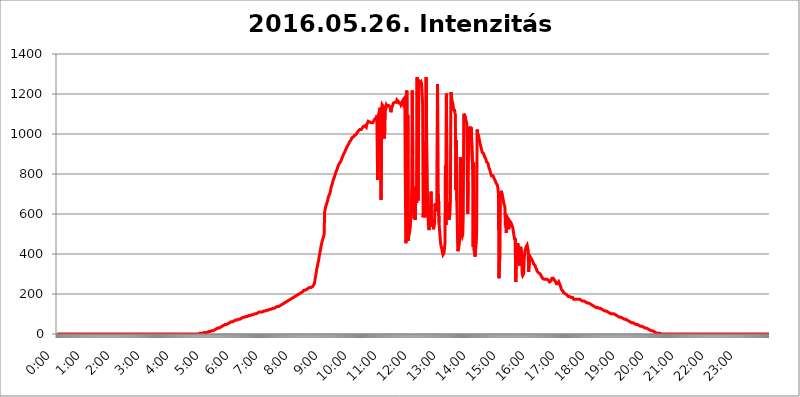
| Category | 2016.05.26. Intenzitás [W/m^2] |
|---|---|
| 0.0 | 0 |
| 0.0006944444444444445 | 0 |
| 0.001388888888888889 | 0 |
| 0.0020833333333333333 | 0 |
| 0.002777777777777778 | 0 |
| 0.003472222222222222 | 0 |
| 0.004166666666666667 | 0 |
| 0.004861111111111111 | 0 |
| 0.005555555555555556 | 0 |
| 0.0062499999999999995 | 0 |
| 0.006944444444444444 | 0 |
| 0.007638888888888889 | 0 |
| 0.008333333333333333 | 0 |
| 0.009027777777777779 | 0 |
| 0.009722222222222222 | 0 |
| 0.010416666666666666 | 0 |
| 0.011111111111111112 | 0 |
| 0.011805555555555555 | 0 |
| 0.012499999999999999 | 0 |
| 0.013194444444444444 | 0 |
| 0.013888888888888888 | 0 |
| 0.014583333333333332 | 0 |
| 0.015277777777777777 | 0 |
| 0.015972222222222224 | 0 |
| 0.016666666666666666 | 0 |
| 0.017361111111111112 | 0 |
| 0.018055555555555557 | 0 |
| 0.01875 | 0 |
| 0.019444444444444445 | 0 |
| 0.02013888888888889 | 0 |
| 0.020833333333333332 | 0 |
| 0.02152777777777778 | 0 |
| 0.022222222222222223 | 0 |
| 0.02291666666666667 | 0 |
| 0.02361111111111111 | 0 |
| 0.024305555555555556 | 0 |
| 0.024999999999999998 | 0 |
| 0.025694444444444447 | 0 |
| 0.02638888888888889 | 0 |
| 0.027083333333333334 | 0 |
| 0.027777777777777776 | 0 |
| 0.02847222222222222 | 0 |
| 0.029166666666666664 | 0 |
| 0.029861111111111113 | 0 |
| 0.030555555555555555 | 0 |
| 0.03125 | 0 |
| 0.03194444444444445 | 0 |
| 0.03263888888888889 | 0 |
| 0.03333333333333333 | 0 |
| 0.034027777777777775 | 0 |
| 0.034722222222222224 | 0 |
| 0.035416666666666666 | 0 |
| 0.036111111111111115 | 0 |
| 0.03680555555555556 | 0 |
| 0.0375 | 0 |
| 0.03819444444444444 | 0 |
| 0.03888888888888889 | 0 |
| 0.03958333333333333 | 0 |
| 0.04027777777777778 | 0 |
| 0.04097222222222222 | 0 |
| 0.041666666666666664 | 0 |
| 0.042361111111111106 | 0 |
| 0.04305555555555556 | 0 |
| 0.043750000000000004 | 0 |
| 0.044444444444444446 | 0 |
| 0.04513888888888889 | 0 |
| 0.04583333333333334 | 0 |
| 0.04652777777777778 | 0 |
| 0.04722222222222222 | 0 |
| 0.04791666666666666 | 0 |
| 0.04861111111111111 | 0 |
| 0.049305555555555554 | 0 |
| 0.049999999999999996 | 0 |
| 0.05069444444444445 | 0 |
| 0.051388888888888894 | 0 |
| 0.052083333333333336 | 0 |
| 0.05277777777777778 | 0 |
| 0.05347222222222222 | 0 |
| 0.05416666666666667 | 0 |
| 0.05486111111111111 | 0 |
| 0.05555555555555555 | 0 |
| 0.05625 | 0 |
| 0.05694444444444444 | 0 |
| 0.057638888888888885 | 0 |
| 0.05833333333333333 | 0 |
| 0.05902777777777778 | 0 |
| 0.059722222222222225 | 0 |
| 0.06041666666666667 | 0 |
| 0.061111111111111116 | 0 |
| 0.06180555555555556 | 0 |
| 0.0625 | 0 |
| 0.06319444444444444 | 0 |
| 0.06388888888888888 | 0 |
| 0.06458333333333334 | 0 |
| 0.06527777777777778 | 0 |
| 0.06597222222222222 | 0 |
| 0.06666666666666667 | 0 |
| 0.06736111111111111 | 0 |
| 0.06805555555555555 | 0 |
| 0.06874999999999999 | 0 |
| 0.06944444444444443 | 0 |
| 0.07013888888888889 | 0 |
| 0.07083333333333333 | 0 |
| 0.07152777777777779 | 0 |
| 0.07222222222222223 | 0 |
| 0.07291666666666667 | 0 |
| 0.07361111111111111 | 0 |
| 0.07430555555555556 | 0 |
| 0.075 | 0 |
| 0.07569444444444444 | 0 |
| 0.0763888888888889 | 0 |
| 0.07708333333333334 | 0 |
| 0.07777777777777778 | 0 |
| 0.07847222222222222 | 0 |
| 0.07916666666666666 | 0 |
| 0.0798611111111111 | 0 |
| 0.08055555555555556 | 0 |
| 0.08125 | 0 |
| 0.08194444444444444 | 0 |
| 0.08263888888888889 | 0 |
| 0.08333333333333333 | 0 |
| 0.08402777777777777 | 0 |
| 0.08472222222222221 | 0 |
| 0.08541666666666665 | 0 |
| 0.08611111111111112 | 0 |
| 0.08680555555555557 | 0 |
| 0.08750000000000001 | 0 |
| 0.08819444444444445 | 0 |
| 0.08888888888888889 | 0 |
| 0.08958333333333333 | 0 |
| 0.09027777777777778 | 0 |
| 0.09097222222222222 | 0 |
| 0.09166666666666667 | 0 |
| 0.09236111111111112 | 0 |
| 0.09305555555555556 | 0 |
| 0.09375 | 0 |
| 0.09444444444444444 | 0 |
| 0.09513888888888888 | 0 |
| 0.09583333333333333 | 0 |
| 0.09652777777777777 | 0 |
| 0.09722222222222222 | 0 |
| 0.09791666666666667 | 0 |
| 0.09861111111111111 | 0 |
| 0.09930555555555555 | 0 |
| 0.09999999999999999 | 0 |
| 0.10069444444444443 | 0 |
| 0.1013888888888889 | 0 |
| 0.10208333333333335 | 0 |
| 0.10277777777777779 | 0 |
| 0.10347222222222223 | 0 |
| 0.10416666666666667 | 0 |
| 0.10486111111111111 | 0 |
| 0.10555555555555556 | 0 |
| 0.10625 | 0 |
| 0.10694444444444444 | 0 |
| 0.1076388888888889 | 0 |
| 0.10833333333333334 | 0 |
| 0.10902777777777778 | 0 |
| 0.10972222222222222 | 0 |
| 0.1111111111111111 | 0 |
| 0.11180555555555556 | 0 |
| 0.11180555555555556 | 0 |
| 0.1125 | 0 |
| 0.11319444444444444 | 0 |
| 0.11388888888888889 | 0 |
| 0.11458333333333333 | 0 |
| 0.11527777777777777 | 0 |
| 0.11597222222222221 | 0 |
| 0.11666666666666665 | 0 |
| 0.1173611111111111 | 0 |
| 0.11805555555555557 | 0 |
| 0.11944444444444445 | 0 |
| 0.12013888888888889 | 0 |
| 0.12083333333333333 | 0 |
| 0.12152777777777778 | 0 |
| 0.12222222222222223 | 0 |
| 0.12291666666666667 | 0 |
| 0.12291666666666667 | 0 |
| 0.12361111111111112 | 0 |
| 0.12430555555555556 | 0 |
| 0.125 | 0 |
| 0.12569444444444444 | 0 |
| 0.12638888888888888 | 0 |
| 0.12708333333333333 | 0 |
| 0.16875 | 0 |
| 0.12847222222222224 | 0 |
| 0.12916666666666668 | 0 |
| 0.12986111111111112 | 0 |
| 0.13055555555555556 | 0 |
| 0.13125 | 0 |
| 0.13194444444444445 | 0 |
| 0.1326388888888889 | 0 |
| 0.13333333333333333 | 0 |
| 0.13402777777777777 | 0 |
| 0.13402777777777777 | 0 |
| 0.13472222222222222 | 0 |
| 0.13541666666666666 | 0 |
| 0.1361111111111111 | 0 |
| 0.13749999999999998 | 0 |
| 0.13819444444444443 | 0 |
| 0.1388888888888889 | 0 |
| 0.13958333333333334 | 0 |
| 0.14027777777777778 | 0 |
| 0.14097222222222222 | 0 |
| 0.14166666666666666 | 0 |
| 0.1423611111111111 | 0 |
| 0.14305555555555557 | 0 |
| 0.14375000000000002 | 0 |
| 0.14444444444444446 | 0 |
| 0.1451388888888889 | 0 |
| 0.1451388888888889 | 0 |
| 0.14652777777777778 | 0 |
| 0.14722222222222223 | 0 |
| 0.14791666666666667 | 0 |
| 0.1486111111111111 | 0 |
| 0.14930555555555555 | 0 |
| 0.15 | 0 |
| 0.15069444444444444 | 0 |
| 0.15138888888888888 | 0 |
| 0.15208333333333332 | 0 |
| 0.15277777777777776 | 0 |
| 0.15347222222222223 | 0 |
| 0.15416666666666667 | 0 |
| 0.15486111111111112 | 0 |
| 0.15555555555555556 | 0 |
| 0.15625 | 0 |
| 0.15694444444444444 | 0 |
| 0.15763888888888888 | 0 |
| 0.15833333333333333 | 0 |
| 0.15902777777777777 | 0 |
| 0.15972222222222224 | 0 |
| 0.16041666666666668 | 0 |
| 0.16111111111111112 | 0 |
| 0.16180555555555556 | 0 |
| 0.1625 | 0 |
| 0.16319444444444445 | 0 |
| 0.1638888888888889 | 0 |
| 0.16458333333333333 | 0 |
| 0.16527777777777777 | 0 |
| 0.16597222222222222 | 0 |
| 0.16666666666666666 | 0 |
| 0.1673611111111111 | 0 |
| 0.16805555555555554 | 0 |
| 0.16874999999999998 | 0 |
| 0.16944444444444443 | 0 |
| 0.17013888888888887 | 0 |
| 0.1708333333333333 | 0 |
| 0.17152777777777775 | 0 |
| 0.17222222222222225 | 0 |
| 0.1729166666666667 | 0 |
| 0.17361111111111113 | 0 |
| 0.17430555555555557 | 0 |
| 0.17500000000000002 | 0 |
| 0.17569444444444446 | 0 |
| 0.1763888888888889 | 0 |
| 0.17708333333333334 | 0 |
| 0.17777777777777778 | 0 |
| 0.17847222222222223 | 0 |
| 0.17916666666666667 | 0 |
| 0.1798611111111111 | 0 |
| 0.18055555555555555 | 0 |
| 0.18125 | 0 |
| 0.18194444444444444 | 0 |
| 0.1826388888888889 | 0 |
| 0.18333333333333335 | 0 |
| 0.1840277777777778 | 0 |
| 0.18472222222222223 | 0 |
| 0.18541666666666667 | 0 |
| 0.18611111111111112 | 0 |
| 0.18680555555555556 | 0 |
| 0.1875 | 0 |
| 0.18819444444444444 | 0 |
| 0.18888888888888888 | 0 |
| 0.18958333333333333 | 0 |
| 0.19027777777777777 | 0 |
| 0.1909722222222222 | 0 |
| 0.19166666666666665 | 0 |
| 0.19236111111111112 | 0 |
| 0.19305555555555554 | 0 |
| 0.19375 | 0 |
| 0.19444444444444445 | 0 |
| 0.1951388888888889 | 0 |
| 0.19583333333333333 | 0 |
| 0.19652777777777777 | 0 |
| 0.19722222222222222 | 0 |
| 0.19791666666666666 | 0 |
| 0.1986111111111111 | 0 |
| 0.19930555555555554 | 3.525 |
| 0.19999999999999998 | 3.525 |
| 0.20069444444444443 | 3.525 |
| 0.20138888888888887 | 3.525 |
| 0.2020833333333333 | 3.525 |
| 0.2027777777777778 | 3.525 |
| 0.2034722222222222 | 3.525 |
| 0.2041666666666667 | 3.525 |
| 0.20486111111111113 | 3.525 |
| 0.20555555555555557 | 3.525 |
| 0.20625000000000002 | 7.887 |
| 0.20694444444444446 | 7.887 |
| 0.2076388888888889 | 7.887 |
| 0.20833333333333334 | 7.887 |
| 0.20902777777777778 | 7.887 |
| 0.20972222222222223 | 7.887 |
| 0.21041666666666667 | 7.887 |
| 0.2111111111111111 | 7.887 |
| 0.21180555555555555 | 12.257 |
| 0.2125 | 12.257 |
| 0.21319444444444444 | 12.257 |
| 0.2138888888888889 | 12.257 |
| 0.21458333333333335 | 12.257 |
| 0.2152777777777778 | 12.257 |
| 0.21597222222222223 | 12.257 |
| 0.21666666666666667 | 16.636 |
| 0.21736111111111112 | 16.636 |
| 0.21805555555555556 | 16.636 |
| 0.21875 | 16.636 |
| 0.21944444444444444 | 21.024 |
| 0.22013888888888888 | 21.024 |
| 0.22083333333333333 | 21.024 |
| 0.22152777777777777 | 25.419 |
| 0.2222222222222222 | 25.419 |
| 0.22291666666666665 | 25.419 |
| 0.2236111111111111 | 25.419 |
| 0.22430555555555556 | 29.823 |
| 0.225 | 29.823 |
| 0.22569444444444445 | 29.823 |
| 0.2263888888888889 | 29.823 |
| 0.22708333333333333 | 29.823 |
| 0.22777777777777777 | 34.234 |
| 0.22847222222222222 | 34.234 |
| 0.22916666666666666 | 34.234 |
| 0.2298611111111111 | 38.653 |
| 0.23055555555555554 | 38.653 |
| 0.23124999999999998 | 38.653 |
| 0.23194444444444443 | 38.653 |
| 0.23263888888888887 | 43.079 |
| 0.2333333333333333 | 43.079 |
| 0.2340277777777778 | 43.079 |
| 0.2347222222222222 | 47.511 |
| 0.2354166666666667 | 47.511 |
| 0.23611111111111113 | 47.511 |
| 0.23680555555555557 | 47.511 |
| 0.23750000000000002 | 47.511 |
| 0.23819444444444446 | 51.951 |
| 0.2388888888888889 | 51.951 |
| 0.23958333333333334 | 51.951 |
| 0.24027777777777778 | 56.398 |
| 0.24097222222222223 | 56.398 |
| 0.24166666666666667 | 56.398 |
| 0.2423611111111111 | 56.398 |
| 0.24305555555555555 | 56.398 |
| 0.24375 | 60.85 |
| 0.24444444444444446 | 60.85 |
| 0.24513888888888888 | 60.85 |
| 0.24583333333333335 | 60.85 |
| 0.2465277777777778 | 65.31 |
| 0.24722222222222223 | 65.31 |
| 0.24791666666666667 | 65.31 |
| 0.24861111111111112 | 65.31 |
| 0.24930555555555556 | 65.31 |
| 0.25 | 69.775 |
| 0.25069444444444444 | 69.775 |
| 0.2513888888888889 | 69.775 |
| 0.2520833333333333 | 69.775 |
| 0.25277777777777777 | 69.775 |
| 0.2534722222222222 | 74.246 |
| 0.25416666666666665 | 74.246 |
| 0.2548611111111111 | 74.246 |
| 0.2555555555555556 | 74.246 |
| 0.25625000000000003 | 74.246 |
| 0.2569444444444445 | 74.246 |
| 0.2576388888888889 | 78.722 |
| 0.25833333333333336 | 78.722 |
| 0.2590277777777778 | 78.722 |
| 0.25972222222222224 | 78.722 |
| 0.2604166666666667 | 83.205 |
| 0.2611111111111111 | 83.205 |
| 0.26180555555555557 | 83.205 |
| 0.2625 | 83.205 |
| 0.26319444444444445 | 83.205 |
| 0.2638888888888889 | 83.205 |
| 0.26458333333333334 | 87.692 |
| 0.2652777777777778 | 87.692 |
| 0.2659722222222222 | 87.692 |
| 0.26666666666666666 | 87.692 |
| 0.2673611111111111 | 87.692 |
| 0.26805555555555555 | 87.692 |
| 0.26875 | 92.184 |
| 0.26944444444444443 | 92.184 |
| 0.2701388888888889 | 92.184 |
| 0.2708333333333333 | 92.184 |
| 0.27152777777777776 | 92.184 |
| 0.2722222222222222 | 92.184 |
| 0.27291666666666664 | 96.682 |
| 0.2736111111111111 | 96.682 |
| 0.2743055555555555 | 96.682 |
| 0.27499999999999997 | 96.682 |
| 0.27569444444444446 | 101.184 |
| 0.27638888888888885 | 101.184 |
| 0.27708333333333335 | 101.184 |
| 0.2777777777777778 | 101.184 |
| 0.27847222222222223 | 101.184 |
| 0.2791666666666667 | 101.184 |
| 0.2798611111111111 | 101.184 |
| 0.28055555555555556 | 101.184 |
| 0.28125 | 105.69 |
| 0.28194444444444444 | 105.69 |
| 0.2826388888888889 | 105.69 |
| 0.2833333333333333 | 110.201 |
| 0.28402777777777777 | 110.201 |
| 0.2847222222222222 | 110.201 |
| 0.28541666666666665 | 110.201 |
| 0.28611111111111115 | 110.201 |
| 0.28680555555555554 | 110.201 |
| 0.28750000000000003 | 110.201 |
| 0.2881944444444445 | 114.716 |
| 0.2888888888888889 | 114.716 |
| 0.28958333333333336 | 114.716 |
| 0.2902777777777778 | 114.716 |
| 0.29097222222222224 | 114.716 |
| 0.2916666666666667 | 114.716 |
| 0.2923611111111111 | 119.235 |
| 0.29305555555555557 | 119.235 |
| 0.29375 | 119.235 |
| 0.29444444444444445 | 119.235 |
| 0.2951388888888889 | 119.235 |
| 0.29583333333333334 | 119.235 |
| 0.2965277777777778 | 119.235 |
| 0.2972222222222222 | 123.758 |
| 0.29791666666666666 | 123.758 |
| 0.2986111111111111 | 123.758 |
| 0.29930555555555555 | 123.758 |
| 0.3 | 123.758 |
| 0.30069444444444443 | 128.284 |
| 0.3013888888888889 | 128.284 |
| 0.3020833333333333 | 128.284 |
| 0.30277777777777776 | 128.284 |
| 0.3034722222222222 | 128.284 |
| 0.30416666666666664 | 128.284 |
| 0.3048611111111111 | 128.284 |
| 0.3055555555555555 | 128.284 |
| 0.30624999999999997 | 132.814 |
| 0.3069444444444444 | 132.814 |
| 0.3076388888888889 | 132.814 |
| 0.30833333333333335 | 137.347 |
| 0.3090277777777778 | 137.347 |
| 0.30972222222222223 | 137.347 |
| 0.3104166666666667 | 137.347 |
| 0.3111111111111111 | 141.884 |
| 0.31180555555555556 | 141.884 |
| 0.3125 | 141.884 |
| 0.31319444444444444 | 146.423 |
| 0.3138888888888889 | 146.423 |
| 0.3145833333333333 | 146.423 |
| 0.31527777777777777 | 150.964 |
| 0.3159722222222222 | 150.964 |
| 0.31666666666666665 | 150.964 |
| 0.31736111111111115 | 150.964 |
| 0.31805555555555554 | 155.509 |
| 0.31875000000000003 | 155.509 |
| 0.3194444444444445 | 155.509 |
| 0.3201388888888889 | 160.056 |
| 0.32083333333333336 | 160.056 |
| 0.3215277777777778 | 164.605 |
| 0.32222222222222224 | 164.605 |
| 0.3229166666666667 | 164.605 |
| 0.3236111111111111 | 164.605 |
| 0.32430555555555557 | 169.156 |
| 0.325 | 169.156 |
| 0.32569444444444445 | 173.709 |
| 0.3263888888888889 | 173.709 |
| 0.32708333333333334 | 173.709 |
| 0.3277777777777778 | 173.709 |
| 0.3284722222222222 | 173.709 |
| 0.32916666666666666 | 178.264 |
| 0.3298611111111111 | 178.264 |
| 0.33055555555555555 | 178.264 |
| 0.33125 | 182.82 |
| 0.33194444444444443 | 182.82 |
| 0.3326388888888889 | 182.82 |
| 0.3333333333333333 | 187.378 |
| 0.3340277777777778 | 187.378 |
| 0.3347222222222222 | 191.937 |
| 0.3354166666666667 | 191.937 |
| 0.3361111111111111 | 191.937 |
| 0.3368055555555556 | 196.497 |
| 0.33749999999999997 | 196.497 |
| 0.33819444444444446 | 196.497 |
| 0.33888888888888885 | 201.058 |
| 0.33958333333333335 | 201.058 |
| 0.34027777777777773 | 201.058 |
| 0.34097222222222223 | 205.62 |
| 0.3416666666666666 | 205.62 |
| 0.3423611111111111 | 205.62 |
| 0.3430555555555555 | 210.182 |
| 0.34375 | 210.182 |
| 0.3444444444444445 | 214.746 |
| 0.3451388888888889 | 214.746 |
| 0.3458333333333334 | 219.309 |
| 0.34652777777777777 | 219.309 |
| 0.34722222222222227 | 219.309 |
| 0.34791666666666665 | 219.309 |
| 0.34861111111111115 | 223.873 |
| 0.34930555555555554 | 223.873 |
| 0.35000000000000003 | 223.873 |
| 0.3506944444444444 | 228.436 |
| 0.3513888888888889 | 228.436 |
| 0.3520833333333333 | 228.436 |
| 0.3527777777777778 | 228.436 |
| 0.3534722222222222 | 233 |
| 0.3541666666666667 | 233 |
| 0.3548611111111111 | 233 |
| 0.35555555555555557 | 233 |
| 0.35625 | 233 |
| 0.35694444444444445 | 237.564 |
| 0.3576388888888889 | 237.564 |
| 0.35833333333333334 | 237.564 |
| 0.3590277777777778 | 242.127 |
| 0.3597222222222222 | 242.127 |
| 0.36041666666666666 | 251.251 |
| 0.3611111111111111 | 260.373 |
| 0.36180555555555555 | 278.603 |
| 0.3625 | 292.259 |
| 0.36319444444444443 | 305.898 |
| 0.3638888888888889 | 324.052 |
| 0.3645833333333333 | 333.113 |
| 0.3652777777777778 | 346.682 |
| 0.3659722222222222 | 360.221 |
| 0.3666666666666667 | 369.23 |
| 0.3673611111111111 | 387.202 |
| 0.3680555555555556 | 400.638 |
| 0.36874999999999997 | 414.035 |
| 0.36944444444444446 | 427.39 |
| 0.37013888888888885 | 440.702 |
| 0.37083333333333335 | 453.968 |
| 0.37152777777777773 | 462.786 |
| 0.37222222222222223 | 471.582 |
| 0.3729166666666666 | 480.356 |
| 0.3736111111111111 | 489.108 |
| 0.3743055555555555 | 497.836 |
| 0.375 | 609.062 |
| 0.3756944444444445 | 621.613 |
| 0.3763888888888889 | 634.105 |
| 0.3770833333333334 | 642.4 |
| 0.37777777777777777 | 650.667 |
| 0.37847222222222227 | 658.909 |
| 0.37916666666666665 | 667.123 |
| 0.37986111111111115 | 679.395 |
| 0.38055555555555554 | 687.544 |
| 0.38125000000000003 | 691.608 |
| 0.3819444444444444 | 699.717 |
| 0.3826388888888889 | 707.8 |
| 0.3833333333333333 | 715.858 |
| 0.3840277777777778 | 731.896 |
| 0.3847222222222222 | 739.877 |
| 0.3854166666666667 | 747.834 |
| 0.3861111111111111 | 755.766 |
| 0.38680555555555557 | 767.62 |
| 0.3875 | 771.559 |
| 0.38819444444444445 | 779.42 |
| 0.3888888888888889 | 787.258 |
| 0.38958333333333334 | 795.074 |
| 0.3902777777777778 | 802.868 |
| 0.3909722222222222 | 810.641 |
| 0.39166666666666666 | 814.519 |
| 0.3923611111111111 | 822.26 |
| 0.39305555555555555 | 829.981 |
| 0.39375 | 837.682 |
| 0.39444444444444443 | 845.365 |
| 0.3951388888888889 | 849.199 |
| 0.3958333333333333 | 853.029 |
| 0.3965277777777778 | 856.855 |
| 0.3972222222222222 | 860.676 |
| 0.3979166666666667 | 864.493 |
| 0.3986111111111111 | 872.114 |
| 0.3993055555555556 | 879.719 |
| 0.39999999999999997 | 883.516 |
| 0.40069444444444446 | 891.099 |
| 0.40138888888888885 | 898.668 |
| 0.40208333333333335 | 902.447 |
| 0.40277777777777773 | 906.223 |
| 0.40347222222222223 | 913.766 |
| 0.4041666666666666 | 917.534 |
| 0.4048611111111111 | 917.534 |
| 0.4055555555555555 | 928.819 |
| 0.40625 | 932.576 |
| 0.4069444444444445 | 940.082 |
| 0.4076388888888889 | 943.832 |
| 0.4083333333333334 | 947.58 |
| 0.40902777777777777 | 951.327 |
| 0.40972222222222227 | 958.814 |
| 0.41041666666666665 | 962.555 |
| 0.41111111111111115 | 966.295 |
| 0.41180555555555554 | 970.034 |
| 0.41250000000000003 | 973.772 |
| 0.4131944444444444 | 981.244 |
| 0.4138888888888889 | 981.244 |
| 0.4145833333333333 | 981.244 |
| 0.4152777777777778 | 984.98 |
| 0.4159722222222222 | 988.714 |
| 0.4166666666666667 | 992.448 |
| 0.4173611111111111 | 996.182 |
| 0.41805555555555557 | 996.182 |
| 0.41875 | 996.182 |
| 0.41944444444444445 | 999.916 |
| 0.4201388888888889 | 1003.65 |
| 0.42083333333333334 | 1007.383 |
| 0.4215277777777778 | 1007.383 |
| 0.4222222222222222 | 1014.852 |
| 0.42291666666666666 | 1018.587 |
| 0.4236111111111111 | 1018.587 |
| 0.42430555555555555 | 1022.323 |
| 0.425 | 1022.323 |
| 0.42569444444444443 | 1022.323 |
| 0.4263888888888889 | 1022.323 |
| 0.4270833333333333 | 1026.06 |
| 0.4277777777777778 | 1029.798 |
| 0.4284722222222222 | 1033.537 |
| 0.4291666666666667 | 1037.277 |
| 0.4298611111111111 | 1037.277 |
| 0.4305555555555556 | 1041.019 |
| 0.43124999999999997 | 1041.019 |
| 0.43194444444444446 | 1041.019 |
| 0.43263888888888885 | 1041.019 |
| 0.43333333333333335 | 1033.537 |
| 0.43402777777777773 | 1048.508 |
| 0.43472222222222223 | 1052.255 |
| 0.4354166666666666 | 1056.004 |
| 0.4361111111111111 | 1063.51 |
| 0.4368055555555555 | 1063.51 |
| 0.4375 | 1059.756 |
| 0.4381944444444445 | 1059.756 |
| 0.4388888888888889 | 1059.756 |
| 0.4395833333333334 | 1059.756 |
| 0.44027777777777777 | 1056.004 |
| 0.44097222222222227 | 1052.255 |
| 0.44166666666666665 | 1052.255 |
| 0.44236111111111115 | 1056.004 |
| 0.44305555555555554 | 1059.756 |
| 0.44375000000000003 | 1063.51 |
| 0.4444444444444444 | 1067.267 |
| 0.4451388888888889 | 1074.789 |
| 0.4458333333333333 | 1078.555 |
| 0.4465277777777778 | 1078.555 |
| 0.4472222222222222 | 1078.555 |
| 0.4479166666666667 | 1082.324 |
| 0.4486111111111111 | 1093.653 |
| 0.44930555555555557 | 771.559 |
| 0.45 | 1089.873 |
| 0.45069444444444445 | 1093.653 |
| 0.4513888888888889 | 1093.653 |
| 0.45208333333333334 | 1116.426 |
| 0.4527777777777778 | 1131.708 |
| 0.4534722222222222 | 909.996 |
| 0.45416666666666666 | 671.22 |
| 0.4548611111111111 | 1124.056 |
| 0.45555555555555555 | 1147.086 |
| 0.45625 | 1147.086 |
| 0.45694444444444443 | 1139.384 |
| 0.4576388888888889 | 1135.543 |
| 0.4583333333333333 | 1124.056 |
| 0.4590277777777778 | 977.508 |
| 0.4597222222222222 | 1112.618 |
| 0.4604166666666667 | 1135.543 |
| 0.4611111111111111 | 1143.232 |
| 0.4618055555555556 | 1135.543 |
| 0.46249999999999997 | 1143.232 |
| 0.46319444444444446 | 1143.232 |
| 0.46388888888888885 | 1143.232 |
| 0.46458333333333335 | 1143.232 |
| 0.46527777777777773 | 1147.086 |
| 0.46597222222222223 | 1143.232 |
| 0.4666666666666666 | 1135.543 |
| 0.4673611111111111 | 1131.708 |
| 0.4680555555555555 | 1108.816 |
| 0.46875 | 1127.879 |
| 0.4694444444444445 | 1131.708 |
| 0.4701388888888889 | 1139.384 |
| 0.4708333333333334 | 1147.086 |
| 0.47152777777777777 | 1154.814 |
| 0.47222222222222227 | 1150.946 |
| 0.47291666666666665 | 1154.814 |
| 0.47361111111111115 | 1158.689 |
| 0.47430555555555554 | 1162.571 |
| 0.47500000000000003 | 1158.689 |
| 0.4756944444444444 | 1158.689 |
| 0.4763888888888889 | 1170.358 |
| 0.4770833333333333 | 1166.46 |
| 0.4777777777777778 | 1170.358 |
| 0.4784722222222222 | 1162.571 |
| 0.4791666666666667 | 1154.814 |
| 0.4798611111111111 | 1158.689 |
| 0.48055555555555557 | 1154.814 |
| 0.48125 | 1154.814 |
| 0.48194444444444445 | 1147.086 |
| 0.4826388888888889 | 1147.086 |
| 0.48333333333333334 | 1150.946 |
| 0.4840277777777778 | 1162.571 |
| 0.4847222222222222 | 1154.814 |
| 0.48541666666666666 | 1154.814 |
| 0.4861111111111111 | 1174.263 |
| 0.48680555555555555 | 1174.263 |
| 0.4875 | 1182.099 |
| 0.48819444444444443 | 763.674 |
| 0.4888888888888889 | 453.968 |
| 0.4895833333333333 | 480.356 |
| 0.4902777777777778 | 1217.812 |
| 0.4909722222222222 | 634.105 |
| 0.4916666666666667 | 1093.653 |
| 0.4923611111111111 | 467.187 |
| 0.4930555555555556 | 493.475 |
| 0.49374999999999997 | 502.192 |
| 0.49444444444444446 | 502.192 |
| 0.49513888888888885 | 532.513 |
| 0.49583333333333335 | 588.009 |
| 0.49652777777777773 | 629.948 |
| 0.49722222222222223 | 735.89 |
| 0.4979166666666666 | 1217.812 |
| 0.4986111111111111 | 898.668 |
| 0.4993055555555555 | 621.613 |
| 0.5 | 592.233 |
| 0.5006944444444444 | 575.299 |
| 0.5013888888888889 | 634.105 |
| 0.5020833333333333 | 571.049 |
| 0.5027777777777778 | 735.89 |
| 0.5034722222222222 | 679.395 |
| 0.5041666666666667 | 654.791 |
| 0.5048611111111111 | 1283.541 |
| 0.5055555555555555 | 723.889 |
| 0.50625 | 667.123 |
| 0.5069444444444444 | 1270.964 |
| 0.5076388888888889 | 1258.511 |
| 0.5083333333333333 | 1262.649 |
| 0.5090277777777777 | 1250.275 |
| 0.5097222222222222 | 1250.275 |
| 0.5104166666666666 | 1258.511 |
| 0.5111111111111112 | 1250.275 |
| 0.5118055555555555 | 1254.387 |
| 0.5125000000000001 | 1143.232 |
| 0.5131944444444444 | 583.779 |
| 0.513888888888889 | 625.784 |
| 0.5145833333333333 | 621.613 |
| 0.5152777777777778 | 962.555 |
| 0.5159722222222222 | 583.779 |
| 0.5166666666666667 | 779.42 |
| 0.517361111111111 | 1283.541 |
| 0.5180555555555556 | 988.714 |
| 0.5187499999999999 | 833.834 |
| 0.5194444444444445 | 642.4 |
| 0.5201388888888888 | 579.542 |
| 0.5208333333333334 | 528.2 |
| 0.5215277777777778 | 519.555 |
| 0.5222222222222223 | 553.986 |
| 0.5229166666666667 | 558.261 |
| 0.5236111111111111 | 634.105 |
| 0.5243055555555556 | 711.832 |
| 0.525 | 536.82 |
| 0.5256944444444445 | 545.416 |
| 0.5263888888888889 | 541.121 |
| 0.5270833333333333 | 566.793 |
| 0.5277777777777778 | 523.88 |
| 0.5284722222222222 | 519.555 |
| 0.5291666666666667 | 562.53 |
| 0.5298611111111111 | 650.667 |
| 0.5305555555555556 | 629.948 |
| 0.53125 | 654.791 |
| 0.5319444444444444 | 629.948 |
| 0.5326388888888889 | 613.252 |
| 0.5333333333333333 | 1250.275 |
| 0.5340277777777778 | 646.537 |
| 0.5347222222222222 | 699.717 |
| 0.5354166666666667 | 553.986 |
| 0.5361111111111111 | 523.88 |
| 0.5368055555555555 | 493.475 |
| 0.5375 | 458.38 |
| 0.5381944444444444 | 440.702 |
| 0.5388888888888889 | 440.702 |
| 0.5395833333333333 | 422.943 |
| 0.5402777777777777 | 405.108 |
| 0.5409722222222222 | 396.164 |
| 0.5416666666666666 | 391.685 |
| 0.5423611111111112 | 405.108 |
| 0.5430555555555555 | 427.39 |
| 0.5437500000000001 | 453.968 |
| 0.5444444444444444 | 841.526 |
| 0.545138888888889 | 545.416 |
| 0.5458333333333333 | 1201.843 |
| 0.5465277777777778 | 695.666 |
| 0.5472222222222222 | 625.784 |
| 0.5479166666666667 | 658.909 |
| 0.548611111111111 | 646.537 |
| 0.5493055555555556 | 571.049 |
| 0.5499999999999999 | 566.793 |
| 0.5506944444444445 | 600.661 |
| 0.5513888888888888 | 658.909 |
| 0.5520833333333334 | 1209.807 |
| 0.5527777777777778 | 1193.918 |
| 0.5534722222222223 | 1170.358 |
| 0.5541666666666667 | 1170.358 |
| 0.5548611111111111 | 1150.946 |
| 0.5555555555555556 | 1131.708 |
| 0.55625 | 1116.426 |
| 0.5569444444444445 | 1124.056 |
| 0.5576388888888889 | 1108.816 |
| 0.5583333333333333 | 1097.437 |
| 0.5590277777777778 | 719.877 |
| 0.5597222222222222 | 970.034 |
| 0.5604166666666667 | 667.123 |
| 0.5611111111111111 | 545.416 |
| 0.5618055555555556 | 414.035 |
| 0.5625 | 418.492 |
| 0.5631944444444444 | 431.833 |
| 0.5638888888888889 | 453.968 |
| 0.5645833333333333 | 475.972 |
| 0.5652777777777778 | 883.516 |
| 0.5659722222222222 | 849.199 |
| 0.5666666666666667 | 506.542 |
| 0.5673611111111111 | 510.885 |
| 0.5680555555555555 | 489.108 |
| 0.56875 | 497.836 |
| 0.5694444444444444 | 600.661 |
| 0.5701388888888889 | 1101.226 |
| 0.5708333333333333 | 1101.226 |
| 0.5715277777777777 | 1101.226 |
| 0.5722222222222222 | 1086.097 |
| 0.5729166666666666 | 1071.027 |
| 0.5736111111111112 | 1071.027 |
| 0.5743055555555555 | 1056.004 |
| 0.5750000000000001 | 1052.255 |
| 0.5756944444444444 | 600.661 |
| 0.576388888888889 | 759.723 |
| 0.5770833333333333 | 1033.537 |
| 0.5777777777777778 | 1026.06 |
| 0.5784722222222222 | 1026.06 |
| 0.5791666666666667 | 1037.277 |
| 0.579861111111111 | 1007.383 |
| 0.5805555555555556 | 1033.537 |
| 0.5812499999999999 | 1029.798 |
| 0.5819444444444445 | 1033.537 |
| 0.5826388888888888 | 822.26 |
| 0.5833333333333334 | 436.27 |
| 0.5840277777777778 | 856.855 |
| 0.5847222222222223 | 418.492 |
| 0.5854166666666667 | 396.164 |
| 0.5861111111111111 | 387.202 |
| 0.5868055555555556 | 391.685 |
| 0.5875 | 382.715 |
| 0.5881944444444445 | 510.885 |
| 0.5888888888888889 | 1022.323 |
| 0.5895833333333333 | 1003.65 |
| 0.5902777777777778 | 999.916 |
| 0.5909722222222222 | 992.448 |
| 0.5916666666666667 | 977.508 |
| 0.5923611111111111 | 962.555 |
| 0.5930555555555556 | 951.327 |
| 0.59375 | 940.082 |
| 0.5944444444444444 | 932.576 |
| 0.5951388888888889 | 921.298 |
| 0.5958333333333333 | 909.996 |
| 0.5965277777777778 | 909.996 |
| 0.5972222222222222 | 909.996 |
| 0.5979166666666667 | 902.447 |
| 0.5986111111111111 | 894.885 |
| 0.5993055555555555 | 887.309 |
| 0.6 | 883.516 |
| 0.6006944444444444 | 887.309 |
| 0.6013888888888889 | 872.114 |
| 0.6020833333333333 | 860.676 |
| 0.6027777777777777 | 856.855 |
| 0.6034722222222222 | 856.855 |
| 0.6041666666666666 | 853.029 |
| 0.6048611111111112 | 841.526 |
| 0.6055555555555555 | 829.981 |
| 0.6062500000000001 | 826.123 |
| 0.6069444444444444 | 818.392 |
| 0.607638888888889 | 806.757 |
| 0.6083333333333333 | 798.974 |
| 0.6090277777777778 | 791.169 |
| 0.6097222222222222 | 791.169 |
| 0.6104166666666667 | 791.169 |
| 0.611111111111111 | 791.169 |
| 0.6118055555555556 | 787.258 |
| 0.6124999999999999 | 779.42 |
| 0.6131944444444445 | 779.42 |
| 0.6138888888888888 | 779.42 |
| 0.6145833333333334 | 763.674 |
| 0.6152777777777778 | 755.766 |
| 0.6159722222222223 | 759.723 |
| 0.6166666666666667 | 751.803 |
| 0.6173611111111111 | 743.859 |
| 0.6180555555555556 | 727.896 |
| 0.61875 | 703.762 |
| 0.6194444444444445 | 278.603 |
| 0.6201388888888889 | 355.712 |
| 0.6208333333333333 | 373.729 |
| 0.6215277777777778 | 695.666 |
| 0.6222222222222222 | 715.858 |
| 0.6229166666666667 | 715.858 |
| 0.6236111111111111 | 703.762 |
| 0.6243055555555556 | 695.666 |
| 0.625 | 679.395 |
| 0.6256944444444444 | 667.123 |
| 0.6263888888888889 | 650.667 |
| 0.6270833333333333 | 650.667 |
| 0.6277777777777778 | 638.256 |
| 0.6284722222222222 | 541.121 |
| 0.6291666666666667 | 562.53 |
| 0.6298611111111111 | 506.542 |
| 0.6305555555555555 | 536.82 |
| 0.63125 | 583.779 |
| 0.6319444444444444 | 583.779 |
| 0.6326388888888889 | 575.299 |
| 0.6333333333333333 | 523.88 |
| 0.6340277777777777 | 566.793 |
| 0.6347222222222222 | 571.049 |
| 0.6354166666666666 | 566.793 |
| 0.6361111111111112 | 558.261 |
| 0.6368055555555555 | 553.986 |
| 0.6375000000000001 | 545.416 |
| 0.6381944444444444 | 541.121 |
| 0.638888888888889 | 532.513 |
| 0.6395833333333333 | 515.223 |
| 0.6402777777777778 | 497.836 |
| 0.6409722222222222 | 493.475 |
| 0.6416666666666667 | 471.582 |
| 0.642361111111111 | 480.356 |
| 0.6430555555555556 | 260.373 |
| 0.6437499999999999 | 346.682 |
| 0.6444444444444445 | 346.682 |
| 0.6451388888888888 | 373.729 |
| 0.6458333333333334 | 453.968 |
| 0.6465277777777778 | 431.833 |
| 0.6472222222222223 | 387.202 |
| 0.6479166666666667 | 418.492 |
| 0.6486111111111111 | 342.162 |
| 0.6493055555555556 | 427.39 |
| 0.65 | 436.27 |
| 0.6506944444444445 | 436.27 |
| 0.6513888888888889 | 396.164 |
| 0.6520833333333333 | 301.354 |
| 0.6527777777777778 | 292.259 |
| 0.6534722222222222 | 287.709 |
| 0.6541666666666667 | 301.354 |
| 0.6548611111111111 | 378.224 |
| 0.6555555555555556 | 400.638 |
| 0.65625 | 418.492 |
| 0.6569444444444444 | 422.943 |
| 0.6576388888888889 | 436.27 |
| 0.6583333333333333 | 440.702 |
| 0.6590277777777778 | 445.129 |
| 0.6597222222222222 | 431.833 |
| 0.6604166666666667 | 418.492 |
| 0.6611111111111111 | 310.44 |
| 0.6618055555555555 | 305.898 |
| 0.6625 | 378.224 |
| 0.6631944444444444 | 387.202 |
| 0.6638888888888889 | 382.715 |
| 0.6645833333333333 | 378.224 |
| 0.6652777777777777 | 373.729 |
| 0.6659722222222222 | 369.23 |
| 0.6666666666666666 | 369.23 |
| 0.6673611111111111 | 360.221 |
| 0.6680555555555556 | 351.198 |
| 0.6687500000000001 | 351.198 |
| 0.6694444444444444 | 351.198 |
| 0.6701388888888888 | 342.162 |
| 0.6708333333333334 | 333.113 |
| 0.6715277777777778 | 328.584 |
| 0.6722222222222222 | 324.052 |
| 0.6729166666666666 | 314.98 |
| 0.6736111111111112 | 314.98 |
| 0.6743055555555556 | 310.44 |
| 0.6749999999999999 | 305.898 |
| 0.6756944444444444 | 305.898 |
| 0.6763888888888889 | 301.354 |
| 0.6770833333333334 | 301.354 |
| 0.6777777777777777 | 296.808 |
| 0.6784722222222223 | 292.259 |
| 0.6791666666666667 | 287.709 |
| 0.6798611111111111 | 287.709 |
| 0.6805555555555555 | 278.603 |
| 0.68125 | 278.603 |
| 0.6819444444444445 | 274.047 |
| 0.6826388888888889 | 274.047 |
| 0.6833333333333332 | 274.047 |
| 0.6840277777777778 | 274.047 |
| 0.6847222222222222 | 274.047 |
| 0.6854166666666667 | 269.49 |
| 0.686111111111111 | 274.047 |
| 0.6868055555555556 | 274.047 |
| 0.6875 | 274.047 |
| 0.6881944444444444 | 274.047 |
| 0.688888888888889 | 269.49 |
| 0.6895833333333333 | 269.49 |
| 0.6902777777777778 | 260.373 |
| 0.6909722222222222 | 264.932 |
| 0.6916666666666668 | 264.932 |
| 0.6923611111111111 | 264.932 |
| 0.6930555555555555 | 269.49 |
| 0.69375 | 278.603 |
| 0.6944444444444445 | 278.603 |
| 0.6951388888888889 | 278.603 |
| 0.6958333333333333 | 278.603 |
| 0.6965277777777777 | 274.047 |
| 0.6972222222222223 | 269.49 |
| 0.6979166666666666 | 264.932 |
| 0.6986111111111111 | 264.932 |
| 0.6993055555555556 | 260.373 |
| 0.7000000000000001 | 251.251 |
| 0.7006944444444444 | 251.251 |
| 0.7013888888888888 | 246.689 |
| 0.7020833333333334 | 251.251 |
| 0.7027777777777778 | 255.813 |
| 0.7034722222222222 | 260.373 |
| 0.7041666666666666 | 260.373 |
| 0.7048611111111112 | 255.813 |
| 0.7055555555555556 | 242.127 |
| 0.7062499999999999 | 233 |
| 0.7069444444444444 | 223.873 |
| 0.7076388888888889 | 219.309 |
| 0.7083333333333334 | 219.309 |
| 0.7090277777777777 | 214.746 |
| 0.7097222222222223 | 210.182 |
| 0.7104166666666667 | 205.62 |
| 0.7111111111111111 | 205.62 |
| 0.7118055555555555 | 201.058 |
| 0.7125 | 201.058 |
| 0.7131944444444445 | 196.497 |
| 0.7138888888888889 | 196.497 |
| 0.7145833333333332 | 196.497 |
| 0.7152777777777778 | 191.937 |
| 0.7159722222222222 | 191.937 |
| 0.7166666666666667 | 187.378 |
| 0.717361111111111 | 187.378 |
| 0.7180555555555556 | 187.378 |
| 0.71875 | 187.378 |
| 0.7194444444444444 | 182.82 |
| 0.720138888888889 | 182.82 |
| 0.7208333333333333 | 182.82 |
| 0.7215277777777778 | 182.82 |
| 0.7222222222222222 | 182.82 |
| 0.7229166666666668 | 182.82 |
| 0.7236111111111111 | 178.264 |
| 0.7243055555555555 | 173.709 |
| 0.725 | 173.709 |
| 0.7256944444444445 | 173.709 |
| 0.7263888888888889 | 173.709 |
| 0.7270833333333333 | 173.709 |
| 0.7277777777777777 | 173.709 |
| 0.7284722222222223 | 173.709 |
| 0.7291666666666666 | 173.709 |
| 0.7298611111111111 | 173.709 |
| 0.7305555555555556 | 173.709 |
| 0.7312500000000001 | 173.709 |
| 0.7319444444444444 | 173.709 |
| 0.7326388888888888 | 173.709 |
| 0.7333333333333334 | 169.156 |
| 0.7340277777777778 | 169.156 |
| 0.7347222222222222 | 169.156 |
| 0.7354166666666666 | 169.156 |
| 0.7361111111111112 | 164.605 |
| 0.7368055555555556 | 164.605 |
| 0.7374999999999999 | 164.605 |
| 0.7381944444444444 | 164.605 |
| 0.7388888888888889 | 164.605 |
| 0.7395833333333334 | 164.605 |
| 0.7402777777777777 | 160.056 |
| 0.7409722222222223 | 160.056 |
| 0.7416666666666667 | 155.509 |
| 0.7423611111111111 | 155.509 |
| 0.7430555555555555 | 155.509 |
| 0.74375 | 155.509 |
| 0.7444444444444445 | 155.509 |
| 0.7451388888888889 | 155.509 |
| 0.7458333333333332 | 150.964 |
| 0.7465277777777778 | 150.964 |
| 0.7472222222222222 | 150.964 |
| 0.7479166666666667 | 146.423 |
| 0.748611111111111 | 146.423 |
| 0.7493055555555556 | 146.423 |
| 0.75 | 146.423 |
| 0.7506944444444444 | 141.884 |
| 0.751388888888889 | 141.884 |
| 0.7520833333333333 | 137.347 |
| 0.7527777777777778 | 137.347 |
| 0.7534722222222222 | 137.347 |
| 0.7541666666666668 | 137.347 |
| 0.7548611111111111 | 132.814 |
| 0.7555555555555555 | 132.814 |
| 0.75625 | 132.814 |
| 0.7569444444444445 | 132.814 |
| 0.7576388888888889 | 132.814 |
| 0.7583333333333333 | 132.814 |
| 0.7590277777777777 | 128.284 |
| 0.7597222222222223 | 128.284 |
| 0.7604166666666666 | 128.284 |
| 0.7611111111111111 | 128.284 |
| 0.7618055555555556 | 128.284 |
| 0.7625000000000001 | 128.284 |
| 0.7631944444444444 | 123.758 |
| 0.7638888888888888 | 123.758 |
| 0.7645833333333334 | 119.235 |
| 0.7652777777777778 | 119.235 |
| 0.7659722222222222 | 119.235 |
| 0.7666666666666666 | 119.235 |
| 0.7673611111111112 | 119.235 |
| 0.7680555555555556 | 114.716 |
| 0.7687499999999999 | 114.716 |
| 0.7694444444444444 | 114.716 |
| 0.7701388888888889 | 114.716 |
| 0.7708333333333334 | 110.201 |
| 0.7715277777777777 | 110.201 |
| 0.7722222222222223 | 110.201 |
| 0.7729166666666667 | 110.201 |
| 0.7736111111111111 | 110.201 |
| 0.7743055555555555 | 105.69 |
| 0.775 | 105.69 |
| 0.7756944444444445 | 105.69 |
| 0.7763888888888889 | 101.184 |
| 0.7770833333333332 | 101.184 |
| 0.7777777777777778 | 101.184 |
| 0.7784722222222222 | 101.184 |
| 0.7791666666666667 | 101.184 |
| 0.779861111111111 | 101.184 |
| 0.7805555555555556 | 101.184 |
| 0.78125 | 96.682 |
| 0.7819444444444444 | 96.682 |
| 0.782638888888889 | 96.682 |
| 0.7833333333333333 | 92.184 |
| 0.7840277777777778 | 92.184 |
| 0.7847222222222222 | 92.184 |
| 0.7854166666666668 | 92.184 |
| 0.7861111111111111 | 92.184 |
| 0.7868055555555555 | 87.692 |
| 0.7875 | 87.692 |
| 0.7881944444444445 | 87.692 |
| 0.7888888888888889 | 83.205 |
| 0.7895833333333333 | 83.205 |
| 0.7902777777777777 | 83.205 |
| 0.7909722222222223 | 83.205 |
| 0.7916666666666666 | 78.722 |
| 0.7923611111111111 | 78.722 |
| 0.7930555555555556 | 78.722 |
| 0.7937500000000001 | 78.722 |
| 0.7944444444444444 | 74.246 |
| 0.7951388888888888 | 74.246 |
| 0.7958333333333334 | 74.246 |
| 0.7965277777777778 | 74.246 |
| 0.7972222222222222 | 74.246 |
| 0.7979166666666666 | 74.246 |
| 0.7986111111111112 | 69.775 |
| 0.7993055555555556 | 69.775 |
| 0.7999999999999999 | 69.775 |
| 0.8006944444444444 | 65.31 |
| 0.8013888888888889 | 65.31 |
| 0.8020833333333334 | 65.31 |
| 0.8027777777777777 | 65.31 |
| 0.8034722222222223 | 60.85 |
| 0.8041666666666667 | 60.85 |
| 0.8048611111111111 | 60.85 |
| 0.8055555555555555 | 56.398 |
| 0.80625 | 56.398 |
| 0.8069444444444445 | 56.398 |
| 0.8076388888888889 | 56.398 |
| 0.8083333333333332 | 51.951 |
| 0.8090277777777778 | 51.951 |
| 0.8097222222222222 | 51.951 |
| 0.8104166666666667 | 51.951 |
| 0.811111111111111 | 47.511 |
| 0.8118055555555556 | 47.511 |
| 0.8125 | 47.511 |
| 0.8131944444444444 | 47.511 |
| 0.813888888888889 | 47.511 |
| 0.8145833333333333 | 47.511 |
| 0.8152777777777778 | 43.079 |
| 0.8159722222222222 | 43.079 |
| 0.8166666666666668 | 43.079 |
| 0.8173611111111111 | 43.079 |
| 0.8180555555555555 | 38.653 |
| 0.81875 | 38.653 |
| 0.8194444444444445 | 38.653 |
| 0.8201388888888889 | 38.653 |
| 0.8208333333333333 | 38.653 |
| 0.8215277777777777 | 34.234 |
| 0.8222222222222223 | 34.234 |
| 0.8229166666666666 | 34.234 |
| 0.8236111111111111 | 34.234 |
| 0.8243055555555556 | 29.823 |
| 0.8250000000000001 | 29.823 |
| 0.8256944444444444 | 29.823 |
| 0.8263888888888888 | 29.823 |
| 0.8270833333333334 | 29.823 |
| 0.8277777777777778 | 25.419 |
| 0.8284722222222222 | 25.419 |
| 0.8291666666666666 | 21.024 |
| 0.8298611111111112 | 21.024 |
| 0.8305555555555556 | 21.024 |
| 0.8312499999999999 | 21.024 |
| 0.8319444444444444 | 21.024 |
| 0.8326388888888889 | 16.636 |
| 0.8333333333333334 | 16.636 |
| 0.8340277777777777 | 16.636 |
| 0.8347222222222223 | 16.636 |
| 0.8354166666666667 | 12.257 |
| 0.8361111111111111 | 12.257 |
| 0.8368055555555555 | 12.257 |
| 0.8375 | 7.887 |
| 0.8381944444444445 | 7.887 |
| 0.8388888888888889 | 7.887 |
| 0.8395833333333332 | 7.887 |
| 0.8402777777777778 | 7.887 |
| 0.8409722222222222 | 3.525 |
| 0.8416666666666667 | 3.525 |
| 0.842361111111111 | 3.525 |
| 0.8430555555555556 | 3.525 |
| 0.84375 | 3.525 |
| 0.8444444444444444 | 3.525 |
| 0.845138888888889 | 3.525 |
| 0.8458333333333333 | 3.525 |
| 0.8465277777777778 | 0 |
| 0.8472222222222222 | 0 |
| 0.8479166666666668 | 0 |
| 0.8486111111111111 | 0 |
| 0.8493055555555555 | 0 |
| 0.85 | 0 |
| 0.8506944444444445 | 0 |
| 0.8513888888888889 | 0 |
| 0.8520833333333333 | 0 |
| 0.8527777777777777 | 0 |
| 0.8534722222222223 | 0 |
| 0.8541666666666666 | 0 |
| 0.8548611111111111 | 0 |
| 0.8555555555555556 | 0 |
| 0.8562500000000001 | 0 |
| 0.8569444444444444 | 0 |
| 0.8576388888888888 | 0 |
| 0.8583333333333334 | 0 |
| 0.8590277777777778 | 0 |
| 0.8597222222222222 | 0 |
| 0.8604166666666666 | 0 |
| 0.8611111111111112 | 0 |
| 0.8618055555555556 | 0 |
| 0.8624999999999999 | 0 |
| 0.8631944444444444 | 0 |
| 0.8638888888888889 | 0 |
| 0.8645833333333334 | 0 |
| 0.8652777777777777 | 0 |
| 0.8659722222222223 | 0 |
| 0.8666666666666667 | 0 |
| 0.8673611111111111 | 0 |
| 0.8680555555555555 | 0 |
| 0.86875 | 0 |
| 0.8694444444444445 | 0 |
| 0.8701388888888889 | 0 |
| 0.8708333333333332 | 0 |
| 0.8715277777777778 | 0 |
| 0.8722222222222222 | 0 |
| 0.8729166666666667 | 0 |
| 0.873611111111111 | 0 |
| 0.8743055555555556 | 0 |
| 0.875 | 0 |
| 0.8756944444444444 | 0 |
| 0.876388888888889 | 0 |
| 0.8770833333333333 | 0 |
| 0.8777777777777778 | 0 |
| 0.8784722222222222 | 0 |
| 0.8791666666666668 | 0 |
| 0.8798611111111111 | 0 |
| 0.8805555555555555 | 0 |
| 0.88125 | 0 |
| 0.8819444444444445 | 0 |
| 0.8826388888888889 | 0 |
| 0.8833333333333333 | 0 |
| 0.8840277777777777 | 0 |
| 0.8847222222222223 | 0 |
| 0.8854166666666666 | 0 |
| 0.8861111111111111 | 0 |
| 0.8868055555555556 | 0 |
| 0.8875000000000001 | 0 |
| 0.8881944444444444 | 0 |
| 0.8888888888888888 | 0 |
| 0.8895833333333334 | 0 |
| 0.8902777777777778 | 0 |
| 0.8909722222222222 | 0 |
| 0.8916666666666666 | 0 |
| 0.8923611111111112 | 0 |
| 0.8930555555555556 | 0 |
| 0.8937499999999999 | 0 |
| 0.8944444444444444 | 0 |
| 0.8951388888888889 | 0 |
| 0.8958333333333334 | 0 |
| 0.8965277777777777 | 0 |
| 0.8972222222222223 | 0 |
| 0.8979166666666667 | 0 |
| 0.8986111111111111 | 0 |
| 0.8993055555555555 | 0 |
| 0.9 | 0 |
| 0.9006944444444445 | 0 |
| 0.9013888888888889 | 0 |
| 0.9020833333333332 | 0 |
| 0.9027777777777778 | 0 |
| 0.9034722222222222 | 0 |
| 0.9041666666666667 | 0 |
| 0.904861111111111 | 0 |
| 0.9055555555555556 | 0 |
| 0.90625 | 0 |
| 0.9069444444444444 | 0 |
| 0.907638888888889 | 0 |
| 0.9083333333333333 | 0 |
| 0.9090277777777778 | 0 |
| 0.9097222222222222 | 0 |
| 0.9104166666666668 | 0 |
| 0.9111111111111111 | 0 |
| 0.9118055555555555 | 0 |
| 0.9125 | 0 |
| 0.9131944444444445 | 0 |
| 0.9138888888888889 | 0 |
| 0.9145833333333333 | 0 |
| 0.9152777777777777 | 0 |
| 0.9159722222222223 | 0 |
| 0.9166666666666666 | 0 |
| 0.9173611111111111 | 0 |
| 0.9180555555555556 | 0 |
| 0.9187500000000001 | 0 |
| 0.9194444444444444 | 0 |
| 0.9201388888888888 | 0 |
| 0.9208333333333334 | 0 |
| 0.9215277777777778 | 0 |
| 0.9222222222222222 | 0 |
| 0.9229166666666666 | 0 |
| 0.9236111111111112 | 0 |
| 0.9243055555555556 | 0 |
| 0.9249999999999999 | 0 |
| 0.9256944444444444 | 0 |
| 0.9263888888888889 | 0 |
| 0.9270833333333334 | 0 |
| 0.9277777777777777 | 0 |
| 0.9284722222222223 | 0 |
| 0.9291666666666667 | 0 |
| 0.9298611111111111 | 0 |
| 0.9305555555555555 | 0 |
| 0.93125 | 0 |
| 0.9319444444444445 | 0 |
| 0.9326388888888889 | 0 |
| 0.9333333333333332 | 0 |
| 0.9340277777777778 | 0 |
| 0.9347222222222222 | 0 |
| 0.9354166666666667 | 0 |
| 0.936111111111111 | 0 |
| 0.9368055555555556 | 0 |
| 0.9375 | 0 |
| 0.9381944444444444 | 0 |
| 0.938888888888889 | 0 |
| 0.9395833333333333 | 0 |
| 0.9402777777777778 | 0 |
| 0.9409722222222222 | 0 |
| 0.9416666666666668 | 0 |
| 0.9423611111111111 | 0 |
| 0.9430555555555555 | 0 |
| 0.94375 | 0 |
| 0.9444444444444445 | 0 |
| 0.9451388888888889 | 0 |
| 0.9458333333333333 | 0 |
| 0.9465277777777777 | 0 |
| 0.9472222222222223 | 0 |
| 0.9479166666666666 | 0 |
| 0.9486111111111111 | 0 |
| 0.9493055555555556 | 0 |
| 0.9500000000000001 | 0 |
| 0.9506944444444444 | 0 |
| 0.9513888888888888 | 0 |
| 0.9520833333333334 | 0 |
| 0.9527777777777778 | 0 |
| 0.9534722222222222 | 0 |
| 0.9541666666666666 | 0 |
| 0.9548611111111112 | 0 |
| 0.9555555555555556 | 0 |
| 0.9562499999999999 | 0 |
| 0.9569444444444444 | 0 |
| 0.9576388888888889 | 0 |
| 0.9583333333333334 | 0 |
| 0.9590277777777777 | 0 |
| 0.9597222222222223 | 0 |
| 0.9604166666666667 | 0 |
| 0.9611111111111111 | 0 |
| 0.9618055555555555 | 0 |
| 0.9625 | 0 |
| 0.9631944444444445 | 0 |
| 0.9638888888888889 | 0 |
| 0.9645833333333332 | 0 |
| 0.9652777777777778 | 0 |
| 0.9659722222222222 | 0 |
| 0.9666666666666667 | 0 |
| 0.967361111111111 | 0 |
| 0.9680555555555556 | 0 |
| 0.96875 | 0 |
| 0.9694444444444444 | 0 |
| 0.970138888888889 | 0 |
| 0.9708333333333333 | 0 |
| 0.9715277777777778 | 0 |
| 0.9722222222222222 | 0 |
| 0.9729166666666668 | 0 |
| 0.9736111111111111 | 0 |
| 0.9743055555555555 | 0 |
| 0.975 | 0 |
| 0.9756944444444445 | 0 |
| 0.9763888888888889 | 0 |
| 0.9770833333333333 | 0 |
| 0.9777777777777777 | 0 |
| 0.9784722222222223 | 0 |
| 0.9791666666666666 | 0 |
| 0.9798611111111111 | 0 |
| 0.9805555555555556 | 0 |
| 0.9812500000000001 | 0 |
| 0.9819444444444444 | 0 |
| 0.9826388888888888 | 0 |
| 0.9833333333333334 | 0 |
| 0.9840277777777778 | 0 |
| 0.9847222222222222 | 0 |
| 0.9854166666666666 | 0 |
| 0.9861111111111112 | 0 |
| 0.9868055555555556 | 0 |
| 0.9874999999999999 | 0 |
| 0.9881944444444444 | 0 |
| 0.9888888888888889 | 0 |
| 0.9895833333333334 | 0 |
| 0.9902777777777777 | 0 |
| 0.9909722222222223 | 0 |
| 0.9916666666666667 | 0 |
| 0.9923611111111111 | 0 |
| 0.9930555555555555 | 0 |
| 0.99375 | 0 |
| 0.9944444444444445 | 0 |
| 0.9951388888888889 | 0 |
| 0.9958333333333332 | 0 |
| 0.9965277777777778 | 0 |
| 0.9972222222222222 | 0 |
| 0.9979166666666667 | 0 |
| 0.998611111111111 | 0 |
| 0.9993055555555556 | 0 |